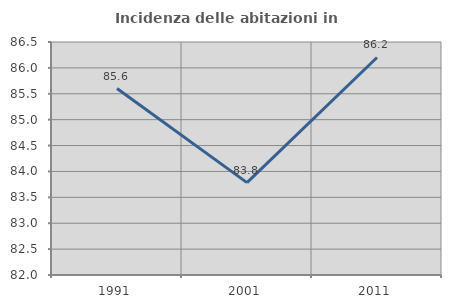
| Category | Incidenza delle abitazioni in proprietà  |
|---|---|
| 1991.0 | 85.602 |
| 2001.0 | 83.784 |
| 2011.0 | 86.201 |